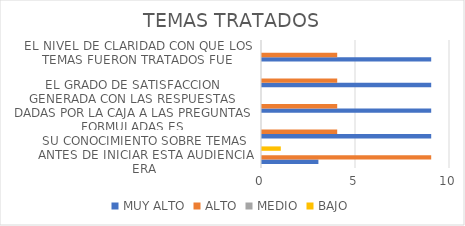
| Category | MUY ALTO | ALTO | MEDIO | BAJO |
|---|---|---|---|---|
| SU CONOCIMIENTO SOBRE TEMAS ANTES DE INICIAR ESTA AUDIENCIA ERA | 3 | 9 | 0 | 1 |
| SU CONOCIMIENTO SOBRE TEMAS DESPUES DE FINALIZAR LA AUDIENCIA ES | 9 | 4 | 0 | 0 |
| EL GRADO DE SATISFACCION GENERADA CON LAS RESPUESTAS DADAS POR LA CAJA A LAS PREGUNTAS FORMULADAS ES | 9 | 4 | 0 | 0 |
| EL NIVEL DE CALIFICACION QUE USTED OTORGA A LA CALIDAD DEL CONTENIDO EN LOS TEMAS TRATADOS ES | 9 | 4 | 0 | 0 |
| EL NIVEL DE CLARIDAD CON QUE LOS TEMAS FUERON TRATADOS FUE | 9 | 4 | 0 | 0 |